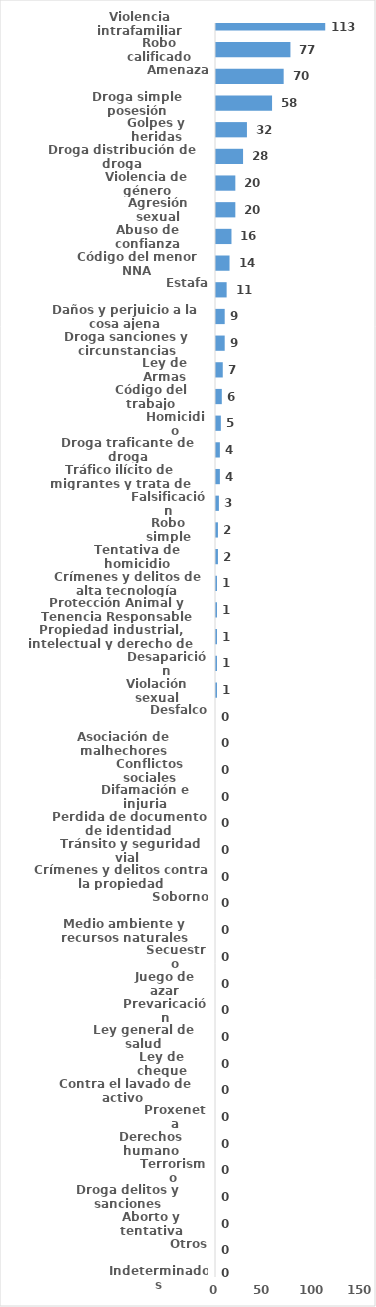
| Category | Series 0 |
|---|---|
| Violencia intrafamiliar | 113 |
| Robo calificado | 77 |
| Amenaza | 70 |
| Droga simple posesión | 58 |
| Golpes y heridas | 32 |
| Droga distribución de droga | 28 |
| Violencia de género | 20 |
| Agresión sexual | 20 |
| Abuso de confianza | 16 |
| Código del menor NNA | 14 |
| Estafa | 11 |
| Daños y perjuicio a la cosa ajena | 9 |
| Droga sanciones y circunstancias agravantes | 9 |
| Ley de Armas | 7 |
| Código del trabajo | 6 |
| Homicidio | 5 |
| Droga traficante de droga | 4 |
| Tráfico ilícito de migrantes y trata de personas | 4 |
| Falsificación | 3 |
| Robo simple | 2 |
| Tentativa de homicidio | 2 |
| Crímenes y delitos de alta tecnología | 1 |
| Protección Animal y Tenencia Responsable | 1 |
| Propiedad industrial, intelectual y derecho de autor | 1 |
| Desaparición | 1 |
| Violación sexual | 1 |
| Desfalco | 0 |
| Asociación de malhechores | 0 |
| Conflictos sociales | 0 |
| Difamación e injuria | 0 |
| Perdida de documento de identidad | 0 |
| Tránsito y seguridad vial  | 0 |
| Crímenes y delitos contra la propiedad | 0 |
| Soborno | 0 |
| Medio ambiente y recursos naturales | 0 |
| Secuestro | 0 |
| Juego de azar | 0 |
| Prevaricación | 0 |
| Ley general de salud | 0 |
| Ley de cheque | 0 |
| Contra el lavado de activo  | 0 |
| Proxeneta | 0 |
| Derechos humano | 0 |
| Terrorismo | 0 |
| Droga delitos y sanciones | 0 |
| Aborto y tentativa | 0 |
| Otros | 0 |
| Indeterminados | 0 |